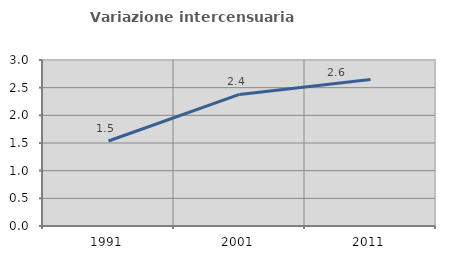
| Category | Variazione intercensuaria annua |
|---|---|
| 1991.0 | 1.537 |
| 2001.0 | 2.378 |
| 2011.0 | 2.646 |